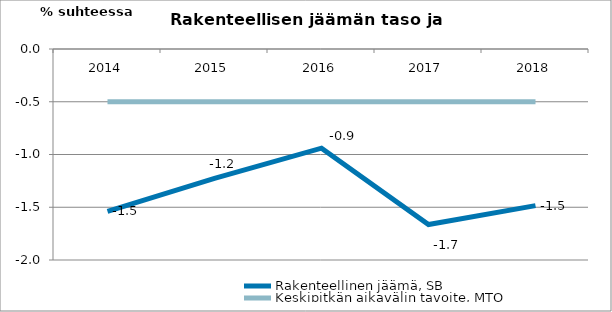
| Category | Rakenteellinen jäämä, SB | Keskipitkän aikavälin tavoite, MTO |
|---|---|---|
| 2014.0 | -1.54 | -0.5 |
| 2015.0 | -1.226 | -0.5 |
| 2016.0 | -0.94 | -0.5 |
| 2017.0 | -1.664 | -0.5 |
| 2018.0 | -1.485 | -0.5 |